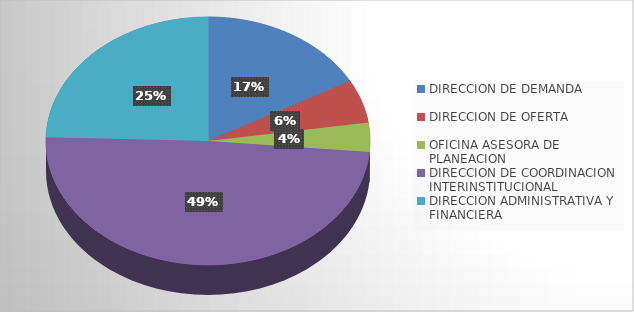
| Category | Series 0 |
|---|---|
| DIRECCION DE DEMANDA | 9 |
| DIRECCION DE OFERTA | 3 |
| OFICINA ASESORA DE PLANEACION | 2 |
| DIRECCION DE COORDINACION INTERINSTITUCIONAL | 26 |
| DIRECCION ADMINISTRATIVA Y FINANCIERA | 13 |